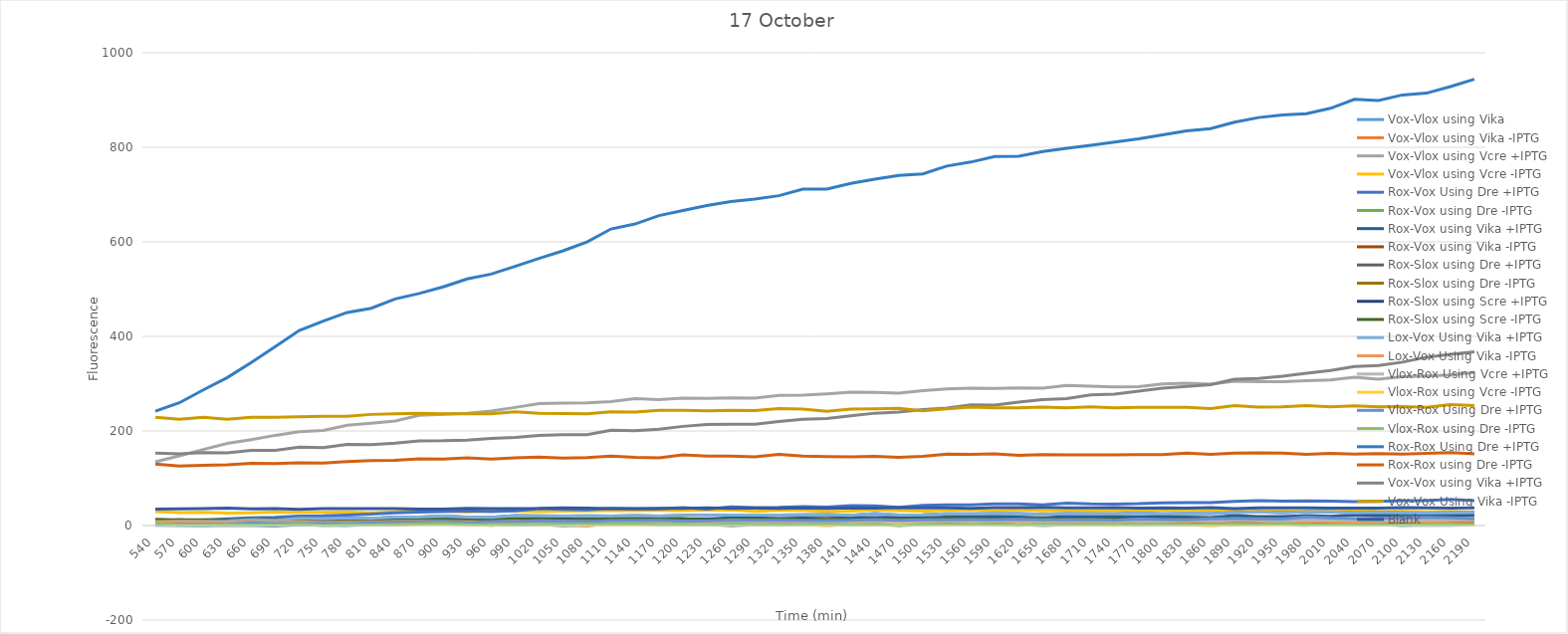
| Category | Vox-Vlox using Vika | Vox-Vlox using Vika -IPTG | Vox-Vlox using Vcre +IPTG | Vox-Vlox using Vcre -IPTG | Rox-Vox Using Dre +IPTG | Rox-Vox using Dre -IPTG | Rox-Vox using Vika +IPTG | Rox-Vox using Vika -IPTG | Rox-Slox using Dre +IPTG | Rox-Slox using Dre -IPTG | Rox-Slox using Scre +IPTG | Rox-Slox using Scre -IPTG | Lox-Vox Using Vika +IPTG | Lox-Vox Using Vika -IPTG | Vlox-Rox Using Vcre +IPTG | Vlox-Rox using Vcre -IPTG | Vlox-Rox Using Dre +IPTG | Vlox-Rox using Dre -IPTG | Rox-Rox Using Dre +IPTG | Rox-Rox using Dre -IPTG | Vox-Vox using Vika +IPTG | Vox-Vox Using Vika -IPTG | Blank |
|---|---|---|---|---|---|---|---|---|---|---|---|---|---|---|---|---|---|---|---|---|---|---|---|
| 540.0 | 0.5 | 4.25 | 134.75 | 29.5 | 10.25 | 4.5 | 10.25 | 6.75 | 7.75 | 10 | 10.5 | 13.25 | 7.75 | 8 | 1.5 | 2.75 | 2.5 | 4.5 | 241.75 | 130.25 | 153 | 229 | 34.5 |
| 570.0 | 0 | 2.25 | 147.5 | 27.25 | 12 | 2.5 | 10.5 | 5.25 | 9 | 9.5 | 12 | 11.5 | 9 | 8.25 | 1.5 | 1.25 | 2.75 | 1.75 | 259.5 | 126 | 151.75 | 224.75 | 35.25 |
| 600.0 | -0.75 | 1 | 160.75 | 28 | 11.5 | 2.5 | 11.5 | 5 | 9 | 9.75 | 10.5 | 12.25 | 9 | 7.75 | 2.25 | 1.5 | 3.25 | 2.25 | 286.75 | 127.5 | 154 | 228.75 | 36 |
| 630.0 | 0.5 | 1.25 | 173.5 | 26.25 | 14.25 | 3.75 | 10.5 | 5.25 | 9.25 | 10 | 11.25 | 11.25 | 9.25 | 6.75 | 3.75 | 2 | 2.5 | 2 | 313 | 128.25 | 153.5 | 225 | 36.75 |
| 660.0 | 0.125 | 2.125 | 181.625 | 26.875 | 16.375 | 1.875 | 12.875 | 6.625 | 12.375 | 9.625 | 12.875 | 14.125 | 12.375 | 7.875 | 5.125 | 1.625 | 5.875 | 1.625 | 344.625 | 131.375 | 159.125 | 229.125 | 35.125 |
| 690.0 | -1 | 3.25 | 190.75 | 28.5 | 17.5 | 2.75 | 11.25 | 3.75 | 11.25 | 8.75 | 9.5 | 12.75 | 11.25 | 6.75 | 2.5 | 1.5 | 3.5 | 1.5 | 378.25 | 131 | 158.75 | 228.75 | 35.75 |
| 720.0 | 1.375 | 2.875 | 198.375 | 28.125 | 20.125 | 4.375 | 11.625 | 8.625 | 15.375 | 12.375 | 10.625 | 14.125 | 15.375 | 7.875 | 4.875 | 4.125 | 4.875 | 3.625 | 412.625 | 132.875 | 165.875 | 229.875 | 34.375 |
| 750.0 | 0.5 | 1.75 | 201.25 | 27.75 | 20.5 | 2.5 | 12.25 | 5.25 | 14.25 | 9 | 10.5 | 10.75 | 14.25 | 6.25 | 4 | 2.5 | 3.5 | 0.25 | 432.5 | 132.25 | 165 | 231 | 35.75 |
| 780.0 | -0.125 | 4.375 | 212.125 | 28.625 | 22.125 | 1.875 | 12.375 | 6.125 | 15.625 | 9.375 | 11.875 | 12.375 | 15.625 | 6.875 | 4.625 | 2.375 | 4.375 | 2.125 | 450.625 | 135.375 | 171.625 | 230.875 | 35.875 |
| 810.0 | 2 | 3 | 216.5 | 27 | 24 | 3.25 | 13.5 | 4.25 | 15 | 11.25 | 12.25 | 12.5 | 15 | 6.75 | 4.25 | 3 | 5.5 | 1.5 | 459.5 | 137.25 | 171.25 | 235 | 35.75 |
| 840.0 | 1.5 | 1.5 | 221 | 28.75 | 27 | 4.75 | 13.25 | 7 | 18 | 9.75 | 11.25 | 13 | 18 | 9 | 5.25 | 2.75 | 7.25 | 2.5 | 479.25 | 137.75 | 174 | 236.25 | 35.75 |
| 870.0 | 2.5 | 3.25 | 233.25 | 32.25 | 28.25 | 4.5 | 13.75 | 6.75 | 17.75 | 11.5 | 12.75 | 14 | 17.75 | 9 | 6 | 2 | 7.5 | 3.75 | 490.75 | 141.25 | 179 | 237.25 | 34.75 |
| 900.0 | 2.5 | 3.75 | 235.5 | 30.5 | 29.5 | 4.25 | 15.75 | 5.5 | 20 | 12.25 | 12 | 13.5 | 20 | 9 | 4.5 | 2.5 | 8.75 | 4.5 | 504.75 | 140.5 | 179.25 | 236.5 | 34.75 |
| 930.0 | 2.375 | 1.625 | 237.125 | 28.375 | 30.875 | 3.375 | 14.375 | 5.125 | 17.875 | 9.625 | 10.875 | 12.125 | 17.875 | 8.125 | 4.875 | 2.375 | 5.875 | 2.125 | 521.625 | 143.125 | 180.625 | 236.375 | 36.125 |
| 960.0 | 0.375 | 0.875 | 242.125 | 30.375 | 29.625 | 2.625 | 13.375 | 6.875 | 17.375 | 8.625 | 13.375 | 12.375 | 17.375 | 7.625 | 5.375 | 0.625 | 8.375 | 2.125 | 531.875 | 140.625 | 184.125 | 236.125 | 35.875 |
| 990.0 | 2.5 | 2.5 | 249.75 | 31.25 | 31.25 | 2.25 | 13.25 | 5 | 21.25 | 9 | 12.75 | 13.5 | 21.25 | 9.25 | 6 | 5.5 | 8.25 | 3.25 | 548.25 | 143.25 | 186.25 | 240.5 | 36 |
| 1020.0 | 1.875 | 3.375 | 257.875 | 29.625 | 35.875 | 2.625 | 16.125 | 6.875 | 20.375 | 10.125 | 13.375 | 15.375 | 20.375 | 7.375 | 5.125 | 1.375 | 9.875 | 1.625 | 564.875 | 144.625 | 190.625 | 237.625 | 36.125 |
| 1050.0 | -0.375 | 1.875 | 259.125 | 30.375 | 34.375 | 1.875 | 14.375 | 4.875 | 19.875 | 10.125 | 14.125 | 11.375 | 19.875 | 7.875 | 7.875 | 0.875 | 9.375 | 3.375 | 581.125 | 142.875 | 191.875 | 236.625 | 37.375 |
| 1080.0 | 0.625 | -0.375 | 259.375 | 30.875 | 33.375 | 3.125 | 14.625 | 4.375 | 20.625 | 8.625 | 10.625 | 12.625 | 20.625 | 8.625 | 6.125 | 1.125 | 7.875 | 2.875 | 599.625 | 143.625 | 192.125 | 236.375 | 36.875 |
| 1110.0 | 1.5 | 3.5 | 262.25 | 31.75 | 36.5 | 4.5 | 15.75 | 6 | 20 | 10 | 12.25 | 14.25 | 20 | 7.25 | 8 | 1.75 | 10.75 | 3.75 | 627.25 | 146.75 | 201.5 | 240.75 | 36 |
| 1140.0 | 2.5 | 2.75 | 268.5 | 31.5 | 35.5 | 4.25 | 16.25 | 6.5 | 21 | 10.75 | 14.25 | 14.5 | 21 | 8.75 | 9.25 | 2.75 | 10.5 | 4 | 637.75 | 144 | 200.5 | 240.25 | 35.75 |
| 1170.0 | 2.625 | 2.875 | 266.375 | 32.125 | 35.375 | 3.125 | 16.375 | 5.125 | 20.125 | 9.625 | 11.125 | 13.875 | 20.125 | 7.375 | 7.375 | 1.625 | 10.875 | 1.375 | 655.625 | 143.125 | 203.625 | 243.625 | 36.375 |
| 1200.0 | 1.5 | 2.75 | 269.5 | 31.75 | 38 | 2.25 | 14 | 6.25 | 21.75 | 11.5 | 13.75 | 14.5 | 21.75 | 6.25 | 6.75 | 2.25 | 9.5 | 2.5 | 666.25 | 149.5 | 209.75 | 243.5 | 36.25 |
| 1230.0 | 2.875 | 2.875 | 268.875 | 32.875 | 34.875 | 3.875 | 13.125 | 4.125 | 21.375 | 9.875 | 12.625 | 10.875 | 21.375 | 8.375 | 5.625 | 3.125 | 9.375 | 1.375 | 676.875 | 146.875 | 213.625 | 242.625 | 37.375 |
| 1260.0 | -0.625 | 1.375 | 270.125 | 33.125 | 39.375 | 4.125 | 16.875 | 6.625 | 21.875 | 10.375 | 12.375 | 13.625 | 21.875 | 8.875 | 7.625 | 2.125 | 11.375 | 3.625 | 685.375 | 146.625 | 214.125 | 243.875 | 36.375 |
| 1290.0 | 1.5 | 4 | 269.25 | 29.75 | 37.75 | 5 | 16.25 | 7.25 | 22.25 | 10 | 12.5 | 13.75 | 22.25 | 8.5 | 6.75 | 2.25 | 11 | 2 | 690.75 | 145.25 | 214 | 243.25 | 36.75 |
| 1320.0 | 1.125 | 2.875 | 275.125 | 31.875 | 38.375 | 3.625 | 14.875 | 6.875 | 22.125 | 10.875 | 13.625 | 14.375 | 22.125 | 8.625 | 8.375 | 0.625 | 11.125 | 1.125 | 697.625 | 150.375 | 220.125 | 247.375 | 36.375 |
| 1350.0 | 2.625 | 1.875 | 275.625 | 32.125 | 40.125 | 2.875 | 15.625 | 5.625 | 22.375 | 11.125 | 14.125 | 12.375 | 22.375 | 7.875 | 7.125 | 2.125 | 10.625 | 1.875 | 711.625 | 146.625 | 224.875 | 246.375 | 37.375 |
| 1380.0 | 1.5 | 2.25 | 278.25 | 30.25 | 39 | 2.25 | 15.25 | 7 | 23 | 13.75 | 11 | 12.25 | 23 | 5.75 | 7.5 | -0.75 | 10.75 | 2.75 | 711.5 | 146 | 226.5 | 241.75 | 36.5 |
| 1410.0 | 1.625 | 2.125 | 281.875 | 30.375 | 41.875 | 1.125 | 17.125 | 6.125 | 21.375 | 10.875 | 11.625 | 12.125 | 21.375 | 8.125 | 7.125 | 2.625 | 10.875 | 1.625 | 723.625 | 145.125 | 231.875 | 246.125 | 37.625 |
| 1440.0 | 2.625 | 2.375 | 281.375 | 33.125 | 41.375 | 3.875 | 16.625 | 8.375 | 25.375 | 11.625 | 13.875 | 13.375 | 25.375 | 8.875 | 7.375 | 2.875 | 12.375 | 3.375 | 732.625 | 146.375 | 237.625 | 246.625 | 36.625 |
| 1470.0 | 2.125 | 0.875 | 279.875 | 31.625 | 38.625 | 4.375 | 17.875 | 5.125 | 22.125 | 12.625 | 13.125 | 13.125 | 22.125 | 8.125 | 6.375 | 1.875 | 11.125 | -0.375 | 740.375 | 144.375 | 239.875 | 247.875 | 37.875 |
| 1500.0 | 2.875 | 2.125 | 285.125 | 30.625 | 42.375 | 2.375 | 16.125 | 6.125 | 22.875 | 11.625 | 12.875 | 13.875 | 22.875 | 6.875 | 9.125 | 2.625 | 11.875 | 2.625 | 743.875 | 146.125 | 245.375 | 242.625 | 37.125 |
| 1530.0 | 2 | 4.25 | 288.75 | 32 | 43.75 | 3 | 18 | 7.25 | 24.75 | 12.25 | 13 | 16 | 24.75 | 9.75 | 10 | 1.5 | 12.25 | 2.75 | 760.25 | 151 | 248.5 | 247 | 37.25 |
| 1560.0 | 3.5 | 3.5 | 290.5 | 33.5 | 43.5 | 4.25 | 18 | 8.25 | 24.5 | 12 | 14.75 | 15 | 24.5 | 9 | 9.25 | 3 | 12.5 | 2 | 768.75 | 150.75 | 255 | 250.75 | 36.25 |
| 1590.0 | 2.875 | 2.125 | 290.125 | 31.625 | 45.625 | 2.125 | 19.625 | 6.625 | 25.125 | 11.625 | 12.625 | 14.125 | 25.125 | 8.875 | 8.625 | 0.875 | 11.875 | 2.375 | 780.375 | 151.625 | 254.875 | 249.125 | 37.875 |
| 1620.0 | 2 | 3.25 | 291.25 | 33.5 | 46 | 1.25 | 17.75 | 6.5 | 25.5 | 12 | 12 | 12.5 | 25.5 | 7.5 | 9.75 | 2 | 13 | 0.75 | 781.25 | 148.5 | 261 | 249 | 38 |
| 1650.0 | -0.125 | 1.875 | 290.625 | 31.125 | 43.625 | 2.375 | 16.375 | 5.375 | 23.625 | 11.125 | 12.125 | 15.375 | 23.625 | 7.875 | 8.125 | 2.125 | 12.125 | 2.875 | 791.125 | 150.125 | 266.125 | 250.625 | 38.625 |
| 1680.0 | 1.375 | 3.375 | 296.125 | 31.875 | 47.125 | 4.375 | 19.125 | 7.875 | 25.375 | 11.375 | 11.375 | 13.375 | 25.375 | 9.125 | 8.375 | 1.625 | 12.125 | 1.625 | 798.125 | 149.375 | 268.625 | 249.125 | 37.625 |
| 1710.0 | 2.125 | 3.375 | 294.875 | 31.125 | 45.625 | 3.875 | 17.875 | 6.875 | 24.875 | 12.375 | 13.125 | 14.375 | 24.875 | 8.375 | 10.375 | 1.875 | 12.875 | 2.625 | 804.125 | 149.625 | 276.125 | 251.125 | 37.375 |
| 1740.0 | 2.5 | 2.25 | 293 | 31.5 | 45.5 | 2 | 19 | 6.75 | 25 | 11.5 | 11.25 | 14.5 | 25 | 7 | 8.5 | 0.5 | 11.25 | 2.25 | 811 | 149.25 | 278 | 248.75 | 37.75 |
| 1770.0 | 1.5 | 3 | 293.5 | 31.5 | 46.25 | 3 | 18.5 | 6.25 | 26.25 | 12.75 | 12.25 | 13 | 26.25 | 9 | 10 | 2.5 | 13.5 | 2.75 | 818 | 150 | 284.25 | 250.25 | 37 |
| 1800.0 | 2.625 | 3.125 | 299.625 | 32.875 | 48.125 | 4.375 | 19.625 | 5.625 | 24.625 | 11.875 | 13.375 | 12.375 | 24.625 | 8.375 | 8.625 | 1.375 | 12.625 | 1.875 | 826.375 | 149.875 | 290.375 | 250.125 | 37.625 |
| 1830.0 | 2 | 2.25 | 301 | 33.25 | 48.25 | 3 | 18 | 4 | 25.75 | 13.75 | 13.25 | 14.5 | 25.75 | 9.75 | 10.5 | 2 | 12.25 | 2 | 834.75 | 153.25 | 294 | 249.75 | 37 |
| 1860.0 | 1.625 | 2.375 | 298.875 | 32.875 | 48.375 | 1.375 | 16.875 | 5.375 | 25.375 | 10.375 | 12.625 | 14.375 | 25.375 | 8.625 | 10.375 | -0.625 | 14.125 | 2.375 | 839.375 | 150.375 | 298.125 | 247.375 | 37.875 |
| 1890.0 | 1.75 | 2.75 | 305.25 | 32.5 | 51.25 | 2.75 | 21.25 | 7 | 27.5 | 13.75 | 13.75 | 14.75 | 27.5 | 10.5 | 11.75 | 2 | 14.75 | 3.25 | 853 | 153.25 | 309.5 | 253.75 | 36 |
| 1920.0 | 3.875 | 2.875 | 304.375 | 31.875 | 52.875 | 4.375 | 19.125 | 6.125 | 29.125 | 13.625 | 13.625 | 15.625 | 29.125 | 9.625 | 12.875 | 1.125 | 14.375 | 2.625 | 862.875 | 153.875 | 310.875 | 250.375 | 37.125 |
| 1950.0 | 1.375 | 2.875 | 304.125 | 31.375 | 51.375 | 3.375 | 19.125 | 5.875 | 27.125 | 11.625 | 12.375 | 13.375 | 27.125 | 8.375 | 10.125 | 1.125 | 13.875 | 4.375 | 868.625 | 153.375 | 315.625 | 250.875 | 37.625 |
| 1980.0 | 0.5 | 2 | 306.5 | 30.5 | 52.25 | 3.5 | 21 | 5.5 | 29 | 11.25 | 11.75 | 13.5 | 29 | 9.5 | 12.25 | 2 | 17.75 | 1.5 | 871.25 | 150.75 | 322 | 253.5 | 37.25 |
| 2010.0 | 4.5 | 2 | 308 | 30 | 51.75 | 4.75 | 19.25 | 6.5 | 28.75 | 11.25 | 13 | 14.5 | 28.75 | 8 | 11.75 | 1 | 15.75 | 1.75 | 882.5 | 152.5 | 327.75 | 251 | 37 |
| 2040.0 | 2.125 | 2.875 | 313.625 | 32.125 | 50.375 | 1.625 | 21.875 | 6.375 | 26.875 | 11.125 | 13.625 | 13.875 | 26.875 | 8.375 | 11.625 | 1.875 | 14.875 | 1.375 | 901.625 | 151.125 | 336.375 | 253.125 | 36.875 |
| 2070.0 | 2.875 | 3.375 | 309.375 | 30.125 | 51.125 | 1.375 | 21.875 | 6.125 | 27.875 | 12.375 | 12.875 | 15.375 | 27.875 | 7.625 | 10.875 | 1.125 | 14.625 | 1.875 | 899.125 | 151.875 | 338.625 | 250.875 | 36.875 |
| 2100.0 | 0.25 | 2.75 | 314.5 | 29.75 | 52.75 | 3.25 | 21.5 | 6 | 26.75 | 13.5 | 12 | 15 | 26.75 | 10 | 10 | 1.75 | 16.75 | 1.25 | 910.75 | 151.25 | 345.5 | 251.75 | 37.75 |
| 2130.0 | 1 | 1.75 | 316.5 | 28.75 | 52.75 | 2.75 | 21.25 | 5.5 | 26.5 | 11.75 | 11.75 | 13 | 26.5 | 8 | 12 | 1.5 | 17.25 | 2 | 914.5 | 152.5 | 356 | 250 | 37.25 |
| 2160.0 | 0.625 | 3.625 | 318.375 | 29.875 | 55.375 | 3.625 | 21.625 | 7.125 | 27.125 | 11.625 | 13.375 | 15.375 | 27.125 | 10.125 | 12.875 | 2.625 | 16.375 | 2.125 | 928.375 | 154.125 | 362.125 | 255.625 | 36.625 |
| 2190.0 | 2 | 2 | 323.75 | 28.5 | 52.5 | 2.75 | 21.5 | 6.75 | 28 | 12.25 | 13 | 14.25 | 28 | 10.25 | 13.25 | 1 | 14 | 2.75 | 944 | 151.75 | 367.5 | 253.75 | 37.5 |